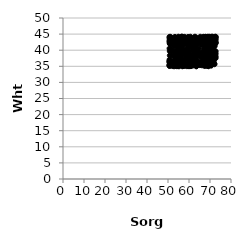
| Category | Series 0 |
|---|---|
| 69.5074841378922 | 35.765 |
| 67.39012154232293 | 36.356 |
| 51.265972334406584 | 40.525 |
| 70.231037858843 | 41.478 |
| 68.68995284497109 | 42.384 |
| 61.770295381413085 | 37.748 |
| 61.1493479746236 | 35.946 |
| 69.22819138420378 | 42.979 |
| 59.39517270721227 | 42.681 |
| 65.66496663998828 | 42.993 |
| 63.40418883278137 | 41.652 |
| 58.53768894739743 | 40.023 |
| 67.32093048026358 | 43.609 |
| 53.44324706286402 | 35.24 |
| 68.8526761222373 | 39.45 |
| 56.378324672565 | 38.708 |
| 54.74872025181661 | 35.036 |
| 53.562311021722486 | 42.587 |
| 69.40337821958032 | 41.023 |
| 58.31372884560104 | 42.192 |
| 54.19694925002738 | 37.862 |
| 70.50930350521683 | 42.185 |
| 58.98531329857994 | 38.121 |
| 54.09205847743413 | 35.044 |
| 68.50835054393295 | 38.073 |
| 50.88482154260436 | 42.442 |
| 59.39646699592479 | 41.588 |
| 60.44532836883708 | 36.519 |
| 61.74536618976886 | 37.868 |
| 60.467245459702134 | 40.825 |
| 72.51332445018275 | 38.812 |
| 67.34884239475443 | 36.381 |
| 58.4222394544873 | 43.072 |
| 70.04040574690247 | 37.696 |
| 65.17509635227043 | 35.365 |
| 57.70184930248967 | 35.361 |
| 70.53504996606307 | 40.462 |
| 70.09033628949342 | 41.777 |
| 55.95162477092219 | 41.93 |
| 68.91750505783835 | 35.102 |
| 60.37630285328624 | 38.092 |
| 52.9288624190135 | 35.007 |
| 70.52098821608017 | 41.564 |
| 52.2382880325813 | 35.074 |
| 61.97619183110158 | 42.244 |
| 58.45793471072526 | 41.845 |
| 70.22945571404227 | 36.664 |
| 66.60631264839492 | 38.461 |
| 63.29953855924743 | 43.092 |
| 70.72941140716769 | 35.804 |
| 67.70190634003342 | 39.119 |
| 56.596837264085366 | 43.51 |
| 54.10399426122643 | 36.562 |
| 56.03619950171433 | 42.789 |
| 50.7423246405848 | 36.649 |
| 52.36475982840321 | 43.659 |
| 55.976475364701386 | 42.697 |
| 67.61646482448316 | 43.584 |
| 71.82542403619314 | 36.777 |
| 60.28208852303406 | 42.075 |
| 67.95869162761383 | 39.021 |
| 71.15224126296287 | 38.605 |
| 55.77798051190119 | 43.722 |
| 61.88208549724719 | 40.324 |
| 53.113216251385566 | 41.274 |
| 65.93275207940817 | 38.553 |
| 69.29213249258747 | 43.538 |
| 69.02768665648361 | 40.097 |
| 69.60353979332514 | 38.894 |
| 62.00486769906214 | 38.943 |
| 68.26908098456984 | 39.058 |
| 59.60914737359206 | 42.487 |
| 68.7920085892697 | 37.039 |
| 68.57213931463689 | 38.708 |
| 61.22502450459953 | 41.66 |
| 57.12147214128301 | 35.075 |
| 67.53072437371901 | 38.354 |
| 68.39787419185697 | 41.82 |
| 50.880659406071786 | 42.126 |
| 52.93424708412824 | 38.222 |
| 50.86667039834863 | 42.029 |
| 69.6667297063037 | 43.623 |
| 54.65407232412575 | 42.508 |
| 55.047073150898214 | 42.072 |
| 56.94445660327114 | 42.519 |
| 56.072549486470365 | 39.047 |
| 72.48214099182911 | 37.931 |
| 55.3991310199863 | 43.316 |
| 58.50205856505138 | 37.21 |
| 67.47738278928357 | 43.65 |
| 50.75621637574177 | 40.541 |
| 68.40331204747741 | 41.742 |
| 68.5284242984147 | 43.959 |
| 72.56881448419448 | 38.707 |
| 57.83498357845103 | 44.135 |
| 71.18550430708734 | 43.426 |
| 61.35455632993656 | 36.614 |
| 66.9779314557466 | 43.502 |
| 63.17446277547505 | 42.62 |
| 67.09349128713708 | 38.783 |
| 52.59006739326082 | 42.464 |
| 64.11429151206404 | 41.702 |
| 54.352295422194 | 40.041 |
| 67.97044227391665 | 37.813 |
| 67.02516972997837 | 42.674 |
| 59.769762883450746 | 37.562 |
| 69.79601720797208 | 39.298 |
| 63.432516621627485 | 35.798 |
| 59.814425620223425 | 39.649 |
| 53.34928782771731 | 42.785 |
| 63.55912179224273 | 42.994 |
| 67.43152355241533 | 35.905 |
| 72.58867332120464 | 38.16 |
| 67.55847477180676 | 42.356 |
| 69.27900580298936 | 42.595 |
| 57.26214195235257 | 40.353 |
| 52.35094596659595 | 42.019 |
| 68.17538017241809 | 43.235 |
| 53.587564749361704 | 35.688 |
| 51.48156976292551 | 39.679 |
| 57.679913071130656 | 35.113 |
| 71.96341023151211 | 42.716 |
| 54.93012565659532 | 43.985 |
| 62.47039215499304 | 38.652 |
| 68.70458204196882 | 40.757 |
| 69.32494095887469 | 35.557 |
| 67.31149790294154 | 40.558 |
| 72.14327855276719 | 35.639 |
| 59.09764618864347 | 42.42 |
| 60.286405882653746 | 38.675 |
| 64.5570220553413 | 40.442 |
| 67.54777456508579 | 42.719 |
| 54.956486667337614 | 41.733 |
| 72.14979194062337 | 38.186 |
| 58.58603458703672 | 35.415 |
| 71.09224585524306 | 42.12 |
| 60.57410226309881 | 42.51 |
| 65.99222170240071 | 38.2 |
| 67.31275323025088 | 38.424 |
| 67.67528270486935 | 38.074 |
| 66.5597240015281 | 42.994 |
| 61.28631144614491 | 42.833 |
| 66.21573402880828 | 38.218 |
| 68.75417675346368 | 35.178 |
| 61.60699960288873 | 36.138 |
| 60.00438783486576 | 37.085 |
| 67.84026244272556 | 44.153 |
| 58.66546708170297 | 39.88 |
| 52.74998789886388 | 39.497 |
| 60.016749821204385 | 39.079 |
| 59.658748042874606 | 43.25 |
| 56.427908676092734 | 38.634 |
| 51.171323332598426 | 44.152 |
| 65.4279317979878 | 38.409 |
| 59.10821800361747 | 37.507 |
| 65.36100191511173 | 43.746 |
| 68.53374259931869 | 36.565 |
| 50.735588242909856 | 42.643 |
| 68.3124341697246 | 38.424 |
| 70.11606397175451 | 40.353 |
| 50.78317920989932 | 36.341 |
| 69.31204574202994 | 38.347 |
| 62.57208300649581 | 40.849 |
| 68.96247971747685 | 42.196 |
| 56.0745933810029 | 43.303 |
| 53.22911797619773 | 41.311 |
| 62.48745530215809 | 36.718 |
| 72.58035791399399 | 39.079 |
| 53.3073329854545 | 44.133 |
| 72.6781621417479 | 37.553 |
| 72.22114723630578 | 41.257 |
| 67.61705576909682 | 37.619 |
| 59.657892838926045 | 35.049 |
| 52.74356640576697 | 36.402 |
| 70.29315860572156 | 37.669 |
| 69.19472601497812 | 40.156 |
| 54.29083083495276 | 36.677 |
| 63.58445299387488 | 42.024 |
| 67.03596081827037 | 40.218 |
| 61.53237858116347 | 41.843 |
| 68.23571793447101 | 35.381 |
| 64.69782002764006 | 38.95 |
| 50.90061098608311 | 43.823 |
| 69.08366842944838 | 43.538 |
| 68.78110239287297 | 43.17 |
| 60.41677553568076 | 42.708 |
| 55.04986232294922 | 39.047 |
| 59.40757705054605 | 35.431 |
| 68.86601109131237 | 44.143 |
| 67.54632649504175 | 41.711 |
| 54.609382220728556 | 35.092 |
| 56.61791862706003 | 41.532 |
| 57.15860587065223 | 42.876 |
| 50.77715463131427 | 35.364 |
| 57.754057404226614 | 43.984 |
| 61.00911455073167 | 43.557 |
| 59.1479015317248 | 38.59 |
| 69.48532692586508 | 41.833 |
| 70.03629243864587 | 42.977 |
| 70.85734334847872 | 42.082 |
| 67.93111417150621 | 37.984 |
| 55.44836125127956 | 35.797 |
| 68.41973637118404 | 41.673 |
| 59.42963765782808 | 42.045 |
| 50.82899803457962 | 36.808 |
| 53.40999014681163 | 38.784 |
| 60.65627755291864 | 35.072 |
| 54.36513782422183 | 41.392 |
| 67.81333050529909 | 42.947 |
| 66.6651887950273 | 39.362 |
| 50.84387434404145 | 43.532 |
| 68.73213726138715 | 40.738 |
| 61.6924567561665 | 42.445 |
| 58.650937781516966 | 42.874 |
| 65.96033413322708 | 41.568 |
| 71.41819800991254 | 37.837 |
| 50.90815736117676 | 35.752 |
| 67.86431256748973 | 36.124 |
| 59.52560068356792 | 41.736 |
| 55.99143489687575 | 40.324 |
| 52.2992830122959 | 41.701 |
| 60.651762873407556 | 41.86 |
| 63.7701839505839 | 37.821 |
| 61.0029034679761 | 35.077 |
| 69.68419651313135 | 37.528 |
| 70.81174165119819 | 42.127 |
| 62.04647465599702 | 35.269 |
| 66.05665512132958 | 39.174 |
| 69.54305763555435 | 36.612 |
| 60.46481037767854 | 38.166 |
| 66.60078377383572 | 43.214 |
| 50.76086116742084 | 35.08 |
| 58.724793597822966 | 37.859 |
| 68.2847840202649 | 40.154 |
| 64.95481557360266 | 39.024 |
| 59.50673641414358 | 42.419 |
| 54.523934314126755 | 42.17 |
| 52.879244946122135 | 41.97 |
| 72.39287351581905 | 42.136 |
| 69.72392449547894 | 42.897 |
| 57.03167639629868 | 41.615 |
| 68.57288606348139 | 38.66 |
| 52.3513569093616 | 42.953 |
| 59.21461472383994 | 40.292 |
| 56.08449580173906 | 38.36 |
| 53.6285212390589 | 37.495 |
| 54.57611832609692 | 43.398 |
| 59.60175718123239 | 35.914 |
| 50.76993133076184 | 36.164 |
| 50.77510357658397 | 43.016 |
| 68.2702206492718 | 42.974 |
| 60.01123349124327 | 35.146 |
| 54.16998676026649 | 39.42 |
| 60.282937793791874 | 43.748 |
| 72.03824428202405 | 41.592 |
| 61.19953609769776 | 35.728 |
| 54.547883239471496 | 43.054 |
| 70.04591485967757 | 44.041 |
| 70.1967983794678 | 42.882 |
| 67.16674111642428 | 42.317 |
| 72.56305289190068 | 42.071 |
| 71.12255188432185 | 42.762 |
| 58.184400572021744 | 43.577 |
| 59.766907840611665 | 38.828 |
| 54.19442947501229 | 42.736 |
| 63.832604871127074 | 38.334 |
| 61.82213399087536 | 39.785 |
| 63.573656900279666 | 35.043 |
| 66.32623469850786 | 43.832 |
| 69.03547765472823 | 39.447 |
| 66.92663673082001 | 44.149 |
| 60.365162111139426 | 38.032 |
| 53.16091668121496 | 43.501 |
| 69.28531885195655 | 36.16 |
| 70.35428181273458 | 43.784 |
| 59.786816754708326 | 40.032 |
| 66.56552240628778 | 37.785 |
| 70.41793364748997 | 39.223 |
| 69.88127045818302 | 42.582 |
| 72.38528614658148 | 37.576 |
| 53.388698858804496 | 37.125 |
| 56.08065646868296 | 43.76 |
| 68.13378958365057 | 42.043 |
| 70.48947627394722 | 42.523 |
| 59.17994319198163 | 42.18 |
| 63.70767707254583 | 36.586 |
| 62.91274782338177 | 39.144 |
| 65.00657472324681 | 42.216 |
| 57.60518834924072 | 36.629 |
| 54.96576088423569 | 44.18 |
| 51.29577561274871 | 41.789 |
| 53.03845260923976 | 38.231 |
| 69.90175539613095 | 42.957 |
| 60.997285968174054 | 38.558 |
| 55.287228414582025 | 35.01 |
| 64.1583327603628 | 42.699 |
| 67.49087391909454 | 42.144 |
| 50.79037047685369 | 35.453 |
| 72.48180289707543 | 42.283 |
| 53.06025867252285 | 38.607 |
| 60.24349104947972 | 43.399 |
| 67.96191292177694 | 42.217 |
| 60.76158645449282 | 36.31 |
| 64.69264572764507 | 43.667 |
| 50.875837458821536 | 38.368 |
| 70.532911769422 | 35.205 |
| 71.14223281325013 | 38.959 |
| 72.6640458576918 | 42.598 |
| 70.97578993021413 | 41.979 |
| 70.73988144463321 | 44.186 |
| 67.52424067864126 | 35.087 |
| 62.35424534584107 | 37.706 |
| 62.199238856007504 | 42.158 |
| 60.06541738193522 | 41.852 |
| 50.786168587464246 | 37.083 |
| 50.84831763382696 | 39.727 |
| 66.21686147624033 | 36.367 |
| 69.5650988821595 | 37.408 |
| 72.67232282288484 | 43.795 |
| 58.89776286095595 | 43.699 |
| 51.62855117938038 | 38.372 |
| 68.84832585739308 | 35.961 |
| 67.24461990963079 | 43.05 |
| 54.752517525459645 | 35.356 |
| 54.98550592868867 | 35.906 |
| 67.85240440512025 | 39.174 |
| 52.41224082954318 | 36.209 |
| 71.32226287629999 | 40.647 |
| 68.20289501528602 | 39.424 |
| 68.23432501990189 | 42.113 |
| 67.01542417412715 | 42.17 |
| 72.61396516781977 | 44.183 |
| 50.720970514189844 | 44.14 |
| 57.447144234317754 | 35.422 |
| 60.2805704164731 | 35.051 |
| 59.57060456218169 | 44.118 |
| 67.46897233653016 | 41.313 |
| 72.62273705649824 | 42.243 |
| 72.23478969244535 | 44.13 |
| 62.410134336998816 | 35.966 |
| 62.69050108196837 | 38.111 |
| 58.52424633854886 | 38.107 |
| 53.935965427067295 | 36.281 |
| 70.50149072320765 | 38.324 |
| 50.80688737434321 | 43.817 |
| 69.93844244999285 | 40.05 |
| 72.53226656799012 | 37.999 |
| 63.43167157440114 | 41.752 |
| 68.7659304646702 | 44.127 |
| 54.891216766029984 | 43.362 |
| 56.293033171022834 | 38.152 |
| 60.64717511079986 | 37.977 |
| 60.687220228657765 | 44.176 |
| 58.889001594251184 | 39.545 |
| 69.7607599362835 | 35.58 |
| 67.7605665773235 | 36.326 |
| 58.10969977028242 | 42.536 |
| 66.4771319505987 | 43.167 |
| 60.66803296447492 | 35.089 |
| 57.379574237914376 | 38.977 |
| 63.60576663909731 | 43.255 |
| 70.26150235109836 | 42.844 |
| 67.55567777044213 | 42.577 |
| 52.30034676655933 | 42.54 |
| 68.63587662488325 | 39.073 |
| 70.13730817883294 | 41.669 |
| 57.03652636931096 | 35.496 |
| 66.6873349679968 | 36.844 |
| 56.43328360848409 | 44.12 |
| 67.09575721389093 | 39.147 |
| 66.26251564735887 | 43.478 |
| 72.25030276590128 | 42.301 |
| 66.15424097749141 | 37.623 |
| 60.02977509023667 | 38.011 |
| 72.00390248398274 | 35.873 |
| 56.259504148836164 | 36.563 |
| 64.1361929997084 | 38.874 |
| 69.66532912884264 | 43.286 |
| 69.96579530945819 | 36.569 |
| 58.63052217895248 | 35.816 |
| 69.40273340737812 | 42.837 |
| 63.10133726653638 | 40.428 |
| 60.13000802678199 | 35.404 |
| 69.81593565543054 | 36.166 |
| 56.565658469632716 | 44.196 |
| 63.240078274993536 | 43.959 |
| 70.89617403543258 | 42.156 |
| 54.89066913395922 | 42.997 |
| 69.26600471462281 | 38.378 |
| 72.65777454994108 | 43.215 |
| 70.15250932844172 | 42.185 |
| 57.30745208907445 | 39.463 |
| 59.40187786274986 | 39.361 |
| 69.33087498127827 | 42.541 |
| 68.15865825672527 | 39.337 |
| 68.60762620933212 | 35.54 |
| 68.54426492406003 | 39.456 |
| 51.399457840070696 | 42.059 |
| 53.89290451907327 | 36.316 |
| 67.83489875020406 | 37.055 |
| 68.8909380225836 | 38.082 |
| 72.52904021229428 | 39.672 |
| 60.440151457026545 | 42.291 |
| 72.57673277737673 | 43.482 |
| 64.22716359298288 | 39.738 |
| 67.89361110028115 | 37.325 |
| 69.49314915534823 | 36.416 |
| 68.34632764163865 | 42.092 |
| 66.43679505970229 | 42.223 |
| 64.2638824201893 | 35.553 |
| 54.78448591130017 | 37.943 |
| 68.22012664256349 | 42.73 |
| 58.78081439042966 | 39.561 |
| 59.002401864762696 | 39.154 |
| 67.20266195486899 | 42.504 |
| 71.2059921010943 | 44.175 |
| 64.7168761814914 | 35.584 |
| 68.91624368473452 | 42.376 |
| 71.33524776985048 | 42.246 |
| 64.04897139335077 | 42.254 |
| 70.0473487467034 | 38.863 |
| 50.7539794142727 | 35.254 |
| 66.37026299492202 | 38.352 |
| 67.31825969857769 | 38.224 |
| 55.19964090285882 | 39.095 |
| 58.95539093681092 | 35.041 |
| 52.49180155494156 | 42.822 |
| 68.14258200117577 | 35.548 |
| 68.79383138049951 | 41.948 |
| 69.77973621745289 | 39.631 |
| 64.17813970482004 | 38.501 |
| 58.53295725841303 | 37.339 |
| 72.21483993062317 | 42.419 |
| 59.73538474382549 | 37.619 |
| 71.18870192939887 | 38.694 |
| 62.363662881748226 | 36.441 |
| 69.35295018109345 | 43.206 |
| 60.36570740561941 | 41.891 |
| 61.02102510308788 | 35.911 |
| 62.81269595278495 | 44.188 |
| 69.96436212305935 | 37.28 |
| 68.09636047965404 | 41.014 |
| 70.50380544484233 | 43.293 |
| 65.3465848514105 | 44.165 |
| 52.70463736288255 | 35.556 |
| 69.74373854695554 | 41.242 |
| 69.56324861953044 | 44.189 |
| 63.44205114107243 | 35.004 |
| 59.65019062633461 | 42.709 |
| 52.35134012310685 | 39.801 |
| 55.465160088310135 | 41.981 |
| 65.52816840103412 | 38.159 |
| 50.81260071188259 | 36.443 |
| 67.50993673364641 | 35.402 |
| 72.64457373483127 | 42.368 |
| 58.082174087937766 | 39.976 |
| 70.6420748859596 | 42.639 |
| 62.01899503484469 | 41.69 |
| 62.43236213765757 | 42.213 |
| 68.93444185939849 | 42.595 |
| 67.01729905233185 | 43.919 |
| 53.47458122403503 | 42.436 |
| 56.210981874374376 | 40.363 |
| 59.00475589257471 | 38.335 |
| 56.85516305037513 | 35.015 |
| 53.883773017628116 | 43.002 |
| 72.6931186367784 | 44.134 |
| 67.68976406881416 | 39.788 |
| 68.01349921906628 | 43.502 |
| 56.602395398702356 | 37.271 |
| 56.065493905177114 | 38.052 |
| 69.31419238776343 | 35.018 |
| 62.69139194045357 | 41.933 |
| 71.74273099838253 | 43.873 |
| 68.13105506291174 | 38.085 |
| 68.15517010405955 | 39.507 |
| 55.6370860924094 | 40.68 |
| 66.88050335202647 | 43.708 |
| 62.55814563067866 | 39.562 |
| 69.00433293395471 | 37.428 |
| 52.87823095945679 | 36.676 |
| 55.37127982598999 | 42.449 |
| 56.68983932050412 | 44.164 |
| 53.84183444522899 | 38.997 |
| 67.77724247166894 | 44.125 |
| 66.88964456385261 | 44.031 |
| 70.27486285819099 | 42.28 |
| 67.60194316533351 | 41.828 |
| 64.76213631371056 | 36.447 |
| 66.56335624706188 | 41.83 |
| 70.2550359741879 | 42.032 |
| 62.590444293778575 | 42.318 |
| 70.4334385172462 | 41.863 |
| 55.60871672957038 | 37.44 |
| 57.871749741372255 | 42.46 |
| 72.63372531360484 | 39.634 |
| 66.23559438096493 | 35.3 |
| 70.84367978278479 | 40.354 |
| 69.99065834582652 | 43.954 |
| 52.17967598534011 | 35.787 |